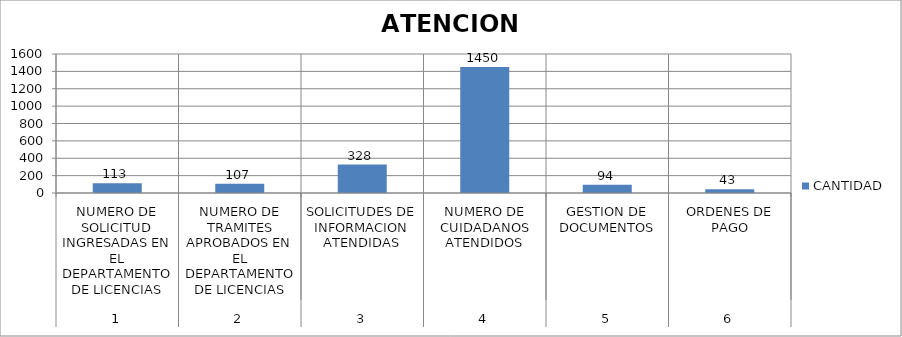
| Category | CANTIDAD |
|---|---|
| 0 | 113 |
| 1 | 107 |
| 2 | 328 |
| 3 | 1450 |
| 4 | 94 |
| 5 | 43 |